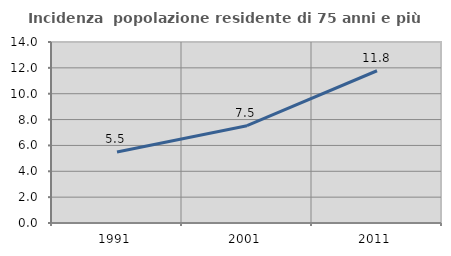
| Category | Incidenza  popolazione residente di 75 anni e più |
|---|---|
| 1991.0 | 5.49 |
| 2001.0 | 7.526 |
| 2011.0 | 11.776 |